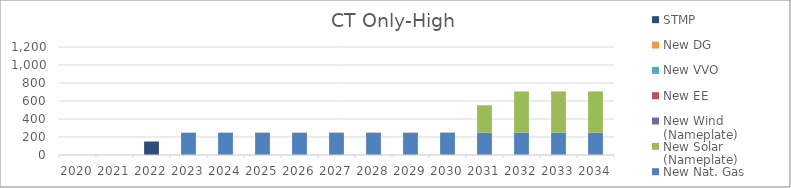
| Category | New Nat. Gas | New Solar (Nameplate) | New Wind (Nameplate) | New EE | New VVO | New DG | STMP |
|---|---|---|---|---|---|---|---|
| 2020.0 | 0 | 0 | 0 | 0 | 0 | 0 | 0 |
| 2021.0 | 0 | 0 | 0 | 0 | 0 | 0 | 0 |
| 2022.0 | 0 | 0 | 0 | 0 | 0 | 0 | 150 |
| 2023.0 | 248 | 0 | 0 | 0 | 0 | 1.022 | 0 |
| 2024.0 | 248 | 0 | 0 | 0 | 0 | 1.533 | 0 |
| 2025.0 | 248 | 0 | 0 | 0 | 0 | 1.533 | 0 |
| 2026.0 | 248 | 0 | 0 | 0 | 0 | 1.533 | 0 |
| 2027.0 | 248 | 0 | 0 | 0 | 0 | 2.044 | 0 |
| 2028.0 | 248 | 0 | 0 | 0 | 0 | 2.044 | 0 |
| 2029.0 | 248 | 0 | 0 | 0 | 0 | 2.555 | 0 |
| 2030.0 | 248 | 0 | 0 | 0 | 0 | 3.066 | 0 |
| 2031.0 | 248 | 303.593 | 0 | 0 | 0 | 3.577 | 0 |
| 2032.0 | 248 | 455.389 | 0 | 0 | 0 | 3.577 | 0 |
| 2033.0 | 248 | 455.389 | 0 | 0 | 0 | 4.088 | 0 |
| 2034.0 | 248 | 455.389 | 0 | 0 | 0 | 4.599 | 0 |